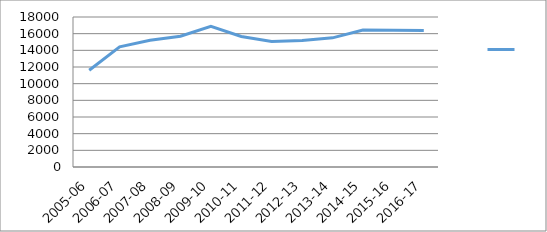
| Category |   |
|---|---|
| 2005-06 | 11607.143 |
| 2006-07 | 14421.839 |
| 2007-08 | 15213.442 |
| 2008-09 | 15689.513 |
| 2009-10 | 16872.279 |
| 2010-11 | 15654.8 |
| 2011-12 | 15058.957 |
| 2012-13 | 15177.727 |
| 2013-14 | 15495.758 |
| 2014-15 | 16442.492 |
| 2015-16 | 16399.623 |
| 2016-17 | 16384.033 |